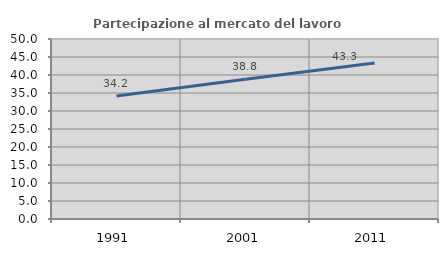
| Category | Partecipazione al mercato del lavoro  femminile |
|---|---|
| 1991.0 | 34.158 |
| 2001.0 | 38.848 |
| 2011.0 | 43.314 |